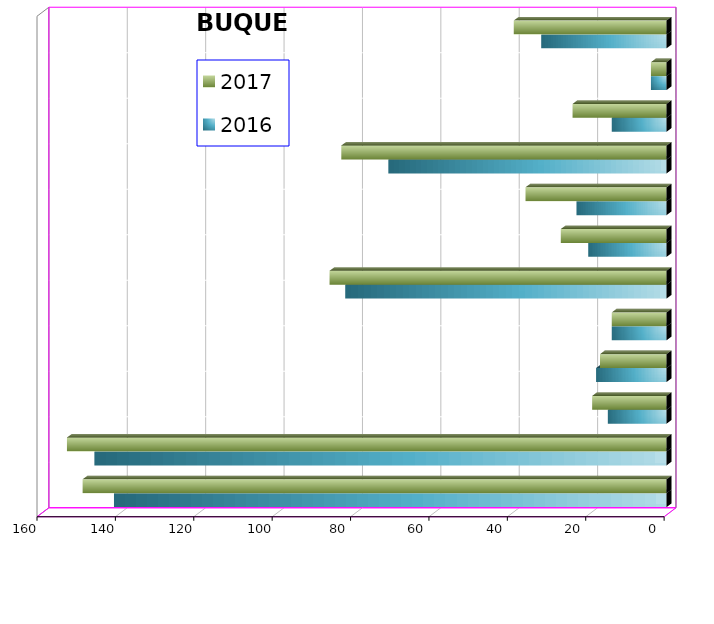
| Category | 2016 | 2017 |
|---|---|---|
| ICAVE | 141 | 149 |
| CICE | 146 | 153 |
| T. C. E. | 15 | 19 |
| CARGILL | 18 | 17 |
| TMV | 14 | 14 |
| SSA | 82 | 86 |
| SEPSA | 20 | 27 |
| VOPAK | 23 | 36 |
| CPV | 71 | 83 |
| EXCELLENCE | 14 | 24 |
| SIP | 4 | 4 |
| PEMEX | 32 | 39 |